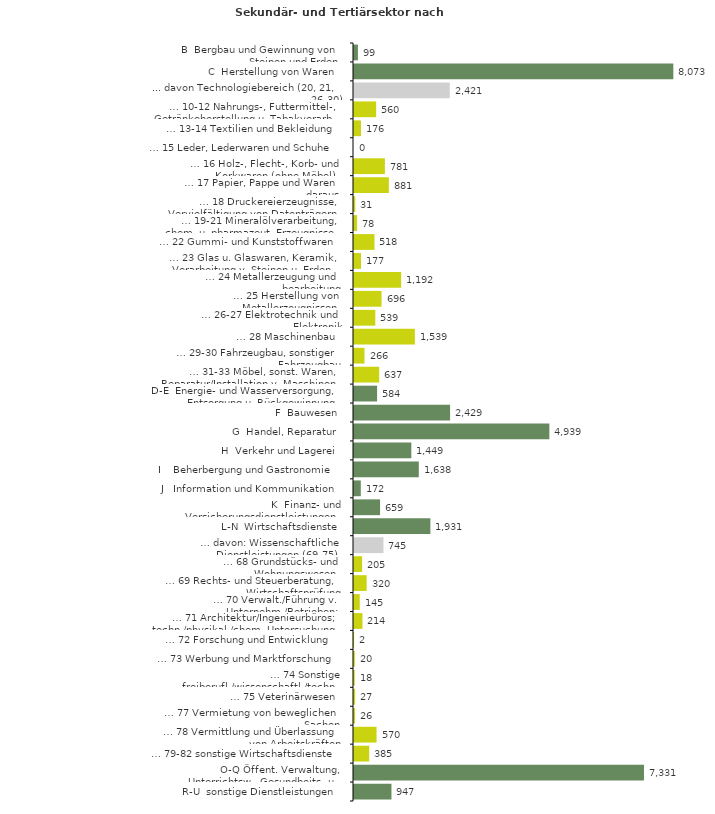
| Category | Series 0 |
|---|---|
| B  Bergbau und Gewinnung von Steinen und Erden | 99 |
| C  Herstellung von Waren | 8073 |
| ... davon Technologiebereich (20, 21, 26-30) | 2421 |
| … 10-12 Nahrungs-, Futtermittel-, Getränkeherstellung u. Tabakverarb. | 560 |
| … 13-14 Textilien und Bekleidung | 176 |
| … 15 Leder, Lederwaren und Schuhe | 0 |
| … 16 Holz-, Flecht-, Korb- und Korkwaren (ohne Möbel)  | 781 |
| … 17 Papier, Pappe und Waren daraus  | 881 |
| … 18 Druckereierzeugnisse, Vervielfältigung von Datenträgern | 31 |
| … 19-21 Mineralölverarbeitung, chem. u. pharmazeut. Erzeugnisse | 78 |
| … 22 Gummi- und Kunststoffwaren | 518 |
| … 23 Glas u. Glaswaren, Keramik, Verarbeitung v. Steinen u. Erden  | 177 |
| … 24 Metallerzeugung und -bearbeitung | 1192 |
| … 25 Herstellung von Metallerzeugnissen  | 696 |
| … 26-27 Elektrotechnik und Elektronik | 539 |
| … 28 Maschinenbau | 1539 |
| … 29-30 Fahrzeugbau, sonstiger Fahrzeugbau | 266 |
| … 31-33 Möbel, sonst. Waren, Reparatur/Installation v. Maschinen | 637 |
| D-E  Energie- und Wasserversorgung, Entsorgung u. Rückgewinnung | 584 |
| F  Bauwesen | 2429 |
| G  Handel, Reparatur | 4939 |
| H  Verkehr und Lagerei | 1449 |
| I    Beherbergung und Gastronomie | 1638 |
| J   Information und Kommunikation | 172 |
| K  Finanz- und Versicherungsdienstleistungen | 659 |
| L-N  Wirtschaftsdienste | 1931 |
| … davon: Wissenschaftliche Dienstleistungen (69-75) | 745 |
| … 68 Grundstücks- und Wohnungswesen  | 205 |
| … 69 Rechts- und Steuerberatung, Wirtschaftsprüfung | 320 |
| … 70 Verwalt./Führung v. Unternehm./Betrieben; Unternehmensberat. | 145 |
| … 71 Architektur/Ingenieurbüros; techn./physikal./chem. Untersuchung | 214 |
| … 72 Forschung und Entwicklung  | 2 |
| … 73 Werbung und Marktforschung | 20 |
| … 74 Sonstige freiberufl./wissenschaftl./techn. Tätigkeiten | 18 |
| … 75 Veterinärwesen | 27 |
| … 77 Vermietung von beweglichen Sachen  | 26 |
| … 78 Vermittlung und Überlassung von Arbeitskräften | 570 |
| … 79-82 sonstige Wirtschaftsdienste | 385 |
| O-Q Öffent. Verwaltung, Unterrichtsw., Gesundheits- u. Sozialwesen | 7331 |
| R-U  sonstige Dienstleistungen | 947 |